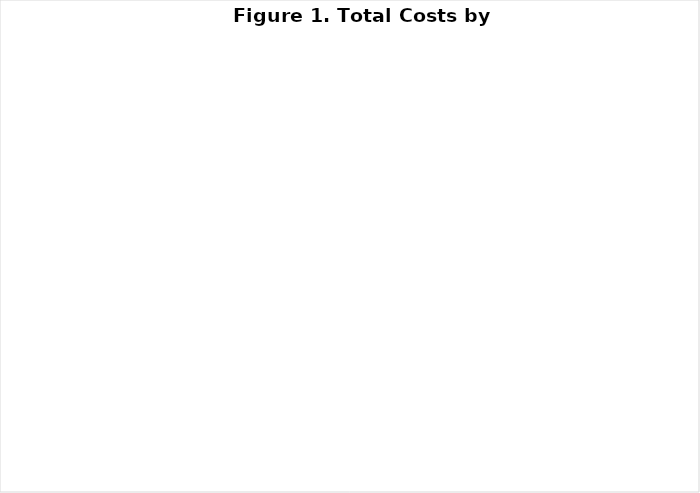
| Category | Series 0 |
|---|---|
| Labor | 0 |
| Overhead and Infrastructure | 0 |
| Contracted Services | 0 |
| Model Cost, Tools, Curricula | 0 |
| Training | 0 |
| Consumable Supplies | 0 |
| Non-consumable Equipment & Supplies | 0 |
| Travel | 0 |